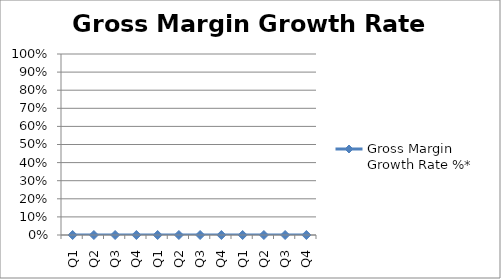
| Category | Gross Margin Growth Rate %* |
|---|---|
| Q1 | 0 |
| Q2 | 0 |
| Q3 | 0 |
| Q4 | 0 |
| Q1 | 0 |
| Q2 | 0 |
| Q3 | 0 |
| Q4 | 0 |
| Q1 | 0 |
| Q2 | 0 |
| Q3 | 0 |
| Q4 | 0 |